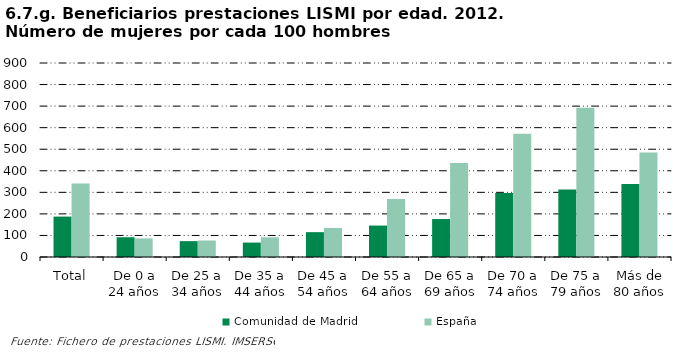
| Category | Comunidad de Madrid | España |
|---|---|---|
| Total | 187.5 | 341.248 |
| De 0 a 24 años | 91.667 | 86.266 |
| De 25 a 34 años | 73.585 | 76.491 |
| De 35 a 44 años | 66.964 | 91.414 |
| De 45 a 54 años | 115.287 | 134.759 |
| De 55 a 64 años | 145.783 | 268.625 |
| De 65 a 69 años | 176.087 | 435.989 |
| De 70 a 74 años | 296.875 | 572.299 |
| De 75 a 79 años | 313.095 | 691.915 |
| Más de 80 años | 339.189 | 484.519 |